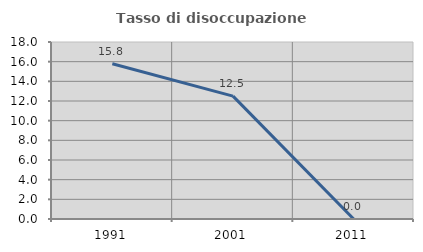
| Category | Tasso di disoccupazione giovanile  |
|---|---|
| 1991.0 | 15.789 |
| 2001.0 | 12.5 |
| 2011.0 | 0 |